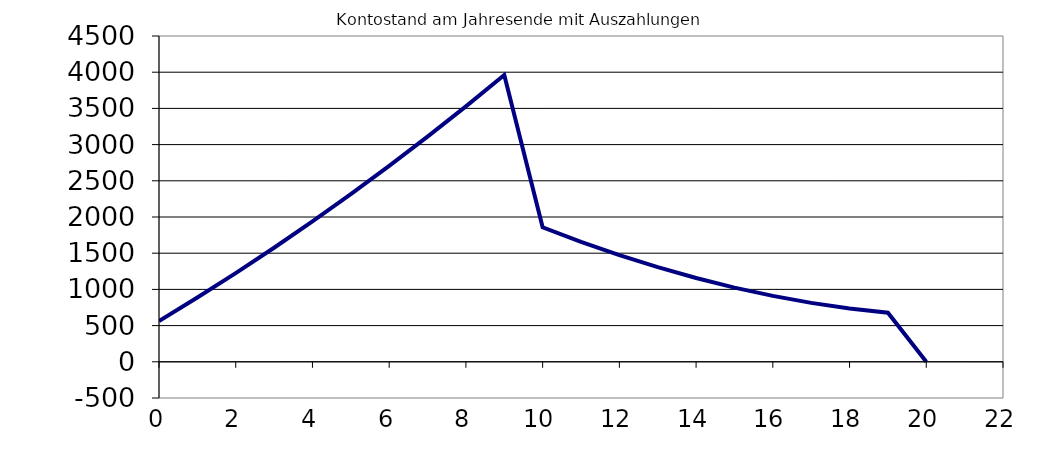
| Category | Kontostand am Jahresende mit Auszahlungen |
|---|---|
| 0.0 | 562.053 |
| 1.0 | 887.283 |
| 2.0 | 1224.825 |
| 3.0 | 1575.02 |
| 4.0 | 1938.213 |
| 5.0 | 2314.759 |
| 6.0 | 2705.019 |
| 7.0 | 3109.365 |
| 8.0 | 3528.173 |
| 9.0 | 3961.831 |
| 10.0 | 1857.132 |
| 11.0 | 1657.745 |
| 12.0 | 1474.418 |
| 13.0 | 1307.571 |
| 14.0 | 1157.634 |
| 15.0 | 1025.047 |
| 16.0 | 910.259 |
| 17.0 | 813.727 |
| 18.0 | 735.92 |
| 19.0 | 677.315 |
| 20.0 | 0 |